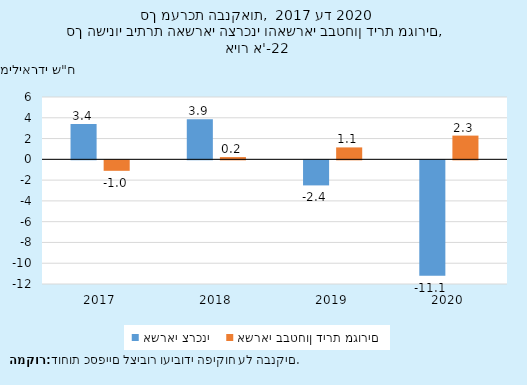
| Category | אשראי צרכני | אשראי בבטחון דירת מגורים |
|---|---|---|
| 2017.0 | 3.392 | -1.009 |
| 2018.0 | 3.854 | 0.217 |
| 2019.0 | -2.413 | 1.148 |
| 2020.0 | -11.106 | 2.284 |